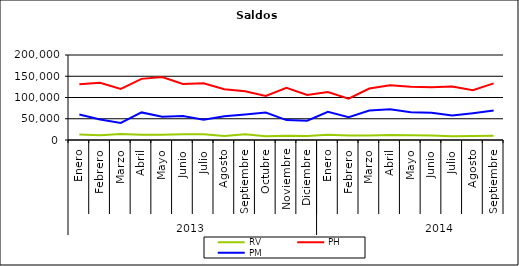
| Category | RV | PH | PM |
|---|---|---|---|
| 0 | 12966.437 | 131380.856 | 59975.653 |
| 1 | 11432.271 | 134655.891 | 48046.612 |
| 2 | 14149.543 | 120343.782 | 40297.909 |
| 3 | 12403.249 | 143830.507 | 64946.114 |
| 4 | 12323.134 | 148139.781 | 54592.514 |
| 5 | 13759.976 | 131634.752 | 56652.701 |
| 6 | 13256.014 | 133515.147 | 47907.561 |
| 7 | 9335.8 | 119600.732 | 55860.576 |
| 8 | 13362.811 | 114843.232 | 59771.51 |
| 9 | 9080.978 | 103607.627 | 64696.186 |
| 10 | 9993.913 | 122533.872 | 46801.148 |
| 11 | 9303.464 | 105747.395 | 45455.331 |
| 12 | 12145.055 | 112918.262 | 66200.17 |
| 13 | 10742.048 | 97242.789 | 53817.215 |
| 14 | 10795.854 | 121097.504 | 69409.543 |
| 15 | 11604.091 | 128798.176 | 72161.549 |
| 16 | 11264.83 | 125268.689 | 65570.493 |
| 17 | 10724.052 | 123922.82 | 64054.99 |
| 18 | 9051.652 | 126086.706 | 57402.892 |
| 19 | 9700.076 | 117038.593 | 63086.988 |
| 20 | 9709.733 | 133155.935 | 69429.611 |